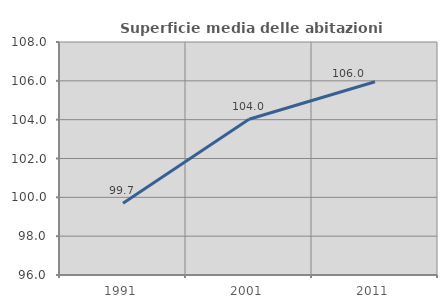
| Category | Superficie media delle abitazioni occupate |
|---|---|
| 1991.0 | 99.696 |
| 2001.0 | 104.02 |
| 2011.0 | 105.954 |